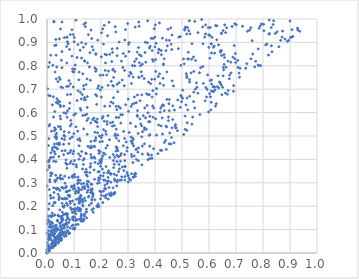
| Category | Series 0 |
|---|---|
| 0.20659024617600152 | 0.216 |
| 0.1595882859350992 | 0.366 |
| 0.5022783122837734 | 0.661 |
| 0.014627011601735303 | 0.023 |
| 0.8708775679135857 | 0.923 |
| 0.1238269095024919 | 0.231 |
| 0.2748066383766688 | 0.425 |
| 0.5081700501069504 | 0.808 |
| 0.5369264353859214 | 0.895 |
| 0.22940533535306296 | 0.28 |
| 0.0507291012930598 | 0.075 |
| 0.08151948562963185 | 0.515 |
| 0.23282890487622582 | 0.341 |
| 0.3509470010056096 | 0.496 |
| 0.1350176189112731 | 0.379 |
| 0.46287678871345395 | 0.931 |
| 0.011119935692606994 | 0.07 |
| 0.645812839691758 | 0.939 |
| 0.41077523659619003 | 0.424 |
| 0.38567772816234314 | 0.917 |
| 0.04700696801618684 | 0.647 |
| 0.6532315311546384 | 0.793 |
| 0.3492561073725203 | 0.842 |
| 0.011562703818986648 | 0.068 |
| 0.08128342170374568 | 0.467 |
| 0.21867603945372405 | 0.369 |
| 0.4439375430555527 | 0.774 |
| 0.24468991328158657 | 0.64 |
| 0.005265783653080119 | 0.007 |
| 0.03794246538813923 | 0.101 |
| 0.12398156293495016 | 0.686 |
| 0.5194820389745708 | 0.556 |
| 0.25600010063105594 | 0.454 |
| 0.5727020444227984 | 0.998 |
| 0.26732817516646984 | 0.901 |
| 0.16612893364222417 | 0.294 |
| 0.4982095696546795 | 0.647 |
| 0.2536260374636236 | 0.503 |
| 0.0406699299817603 | 0.068 |
| 0.2839238283861116 | 0.52 |
| 0.39290793220228815 | 0.917 |
| 0.5985147892601438 | 0.603 |
| 0.042279848248976404 | 0.074 |
| 0.4938443133912794 | 0.623 |
| 0.2620367883453557 | 0.689 |
| 0.16580611699807202 | 0.451 |
| 0.0004538340856108784 | 0.001 |
| 0.05547881544473306 | 0.987 |
| 0.06889590535984585 | 0.079 |
| 0.16266129144415303 | 0.258 |
| 0.8307884937646091 | 0.963 |
| 0.3338823724559998 | 0.859 |
| 0.1186083175830136 | 0.235 |
| 0.20101279854767606 | 0.396 |
| 0.0937517599832609 | 0.496 |
| 0.6934723897624867 | 0.887 |
| 0.20476507593976015 | 0.576 |
| 0.04120971670585925 | 0.275 |
| 0.1692985936536823 | 0.57 |
| 0.28629885539675737 | 0.715 |
| 0.0009645296041806804 | 0.354 |
| 0.5360201400004413 | 0.828 |
| 0.0014370166668378303 | 0.015 |
| 0.21203614964695036 | 0.563 |
| 0.08747721386081674 | 0.678 |
| 0.16131557928945228 | 0.37 |
| 0.05291620713172245 | 0.063 |
| 0.027992955133127384 | 0.032 |
| 0.07465261850898208 | 0.128 |
| 0.28460917675159086 | 0.352 |
| 0.06789787563027082 | 0.167 |
| 0.21964435155825754 | 0.248 |
| 0.09632525314077586 | 0.424 |
| 0.10674355390600654 | 0.263 |
| 0.4655703801737191 | 0.57 |
| 0.22894828137979076 | 0.253 |
| 0.23297248603286644 | 0.628 |
| 0.16661025624676912 | 0.267 |
| 0.1603126596140355 | 0.738 |
| 0.04164822182434544 | 0.042 |
| 0.0176482055008865 | 0.132 |
| 0.32437265296795914 | 0.64 |
| 0.17775796684123046 | 0.387 |
| 0.027276738055447277 | 0.038 |
| 0.35143894812218546 | 0.377 |
| 0.045162385770139826 | 0.05 |
| 0.2912353454635478 | 0.633 |
| 0.2892176773023869 | 0.369 |
| 0.044096376337534555 | 0.412 |
| 0.2268841744466071 | 0.23 |
| 0.19620719389889232 | 0.475 |
| 0.14626610581343039 | 0.187 |
| 0.08781791734118258 | 0.566 |
| 0.8025133796760705 | 0.977 |
| 0.5243593504559144 | 0.829 |
| 0.02098822196703764 | 0.202 |
| 0.013335016458879806 | 0.341 |
| 0.12421449983770834 | 0.242 |
| 0.6905324959657552 | 0.691 |
| 0.3610325074669338 | 0.466 |
| 0.22290135023622612 | 0.306 |
| 0.10838356848699818 | 0.377 |
| 0.15693293938461594 | 0.795 |
| 0.14487685588309934 | 0.72 |
| 0.1113108397096847 | 0.142 |
| 0.05356205250043837 | 0.147 |
| 0.09469819685250681 | 0.153 |
| 0.8589839340913255 | 0.882 |
| 0.4317664447428897 | 0.63 |
| 0.6911041914683271 | 0.715 |
| 0.10939038955609642 | 0.367 |
| 0.5471017215747025 | 0.99 |
| 0.4056647748065998 | 0.703 |
| 0.19133648937774336 | 0.715 |
| 0.027040897643454225 | 0.465 |
| 0.24328757192518413 | 0.715 |
| 0.1024548381636977 | 0.275 |
| 0.6462245286756323 | 0.938 |
| 0.25991960203038195 | 0.449 |
| 0.8335189610555185 | 0.86 |
| 0.1415411368095186 | 0.345 |
| 0.0024828525304180452 | 0.032 |
| 0.30916242139304845 | 0.555 |
| 0.3235359217249854 | 0.667 |
| 0.014480959060390633 | 0.428 |
| 0.5211368803131058 | 0.829 |
| 0.1691642494352353 | 0.242 |
| 0.03454848484715177 | 0.312 |
| 0.13327606586924912 | 0.2 |
| 0.31151177574057654 | 0.626 |
| 0.04881213250230101 | 0.087 |
| 0.16277831726001238 | 0.477 |
| 0.03190249505801583 | 0.101 |
| 0.3385858232046443 | 0.449 |
| 0.08122288258608408 | 0.322 |
| 0.11621952628377485 | 0.278 |
| 0.04997162793849228 | 0.115 |
| 0.23518029060121157 | 0.245 |
| 0.1592436388453549 | 0.449 |
| 0.4546871058741175 | 0.513 |
| 0.4882864956598092 | 0.922 |
| 0.3878387553159358 | 0.742 |
| 0.06302644759688579 | 0.118 |
| 0.6766067866337262 | 0.76 |
| 0.5503307607435864 | 0.823 |
| 0.7817152553280945 | 0.803 |
| 0.12068655454654995 | 0.489 |
| 0.3657626592831434 | 0.815 |
| 0.1808631187960183 | 0.493 |
| 0.09716807910446183 | 0.71 |
| 0.001384076321276523 | 0.045 |
| 0.40406813232669453 | 0.896 |
| 0.10815359367835606 | 0.144 |
| 0.38904668184431646 | 0.405 |
| 0.05471505679663392 | 0.28 |
| 0.09707649406101519 | 0.187 |
| 0.6172322283118868 | 0.691 |
| 0.043963096651518915 | 0.228 |
| 0.11875279015427284 | 0.401 |
| 0.598906335418971 | 0.932 |
| 0.30184307695230145 | 0.605 |
| 0.21444660732911167 | 0.311 |
| 0.2050735387628138 | 0.477 |
| 0.36508618736092824 | 0.578 |
| 0.24601927843579666 | 0.395 |
| 0.01054211126879861 | 0.026 |
| 0.1894064867385187 | 0.381 |
| 0.32424942918668864 | 0.819 |
| 0.5648944885562656 | 0.77 |
| 0.031350137540294545 | 0.036 |
| 0.17684319326314119 | 0.791 |
| 0.5058474946666024 | 0.829 |
| 0.3631104485357775 | 0.857 |
| 0.10888442027932162 | 0.229 |
| 0.20375756077747556 | 0.708 |
| 0.11538023529456093 | 0.122 |
| 0.01730898673225143 | 0.341 |
| 0.19331844124164738 | 0.348 |
| 0.3189638941699745 | 0.484 |
| 0.5854776324905514 | 0.65 |
| 0.0014813583867682464 | 0.003 |
| 0.5495039041374055 | 0.701 |
| 0.07966508959427449 | 0.712 |
| 0.11857767642573498 | 0.186 |
| 0.24678986670759645 | 0.365 |
| 0.39546911656590106 | 0.619 |
| 0.05548353004999401 | 0.791 |
| 0.3209536860948876 | 0.458 |
| 0.09246292701876972 | 0.116 |
| 0.6096083973993957 | 0.722 |
| 0.5689405532354916 | 0.792 |
| 0.14750735284607075 | 0.346 |
| 0.26614749646631203 | 0.479 |
| 0.001035197467917322 | 0.006 |
| 0.06048202339999591 | 0.12 |
| 0.03720410399813043 | 0.659 |
| 0.6048720527612496 | 0.737 |
| 0.6093937732804307 | 0.855 |
| 0.06404367304266861 | 0.071 |
| 0.6417404760977942 | 0.726 |
| 0.5777130001267884 | 0.894 |
| 0.1346083622079665 | 0.879 |
| 0.39272117986185145 | 0.58 |
| 0.007095069782430017 | 0.068 |
| 0.1354400369946144 | 0.715 |
| 0.0025038380344605403 | 0.034 |
| 0.2824165209557042 | 0.853 |
| 0.3914595178123973 | 0.629 |
| 0.4431684387093231 | 0.539 |
| 0.49583647471625975 | 0.802 |
| 0.3608749545211894 | 0.535 |
| 0.16566407035842437 | 0.916 |
| 0.8146413815942678 | 0.893 |
| 0.10232666570714039 | 0.208 |
| 0.11922928197169043 | 0.272 |
| 0.5335954819105253 | 0.769 |
| 0.17048895328163857 | 0.249 |
| 0.15844269186271073 | 0.343 |
| 0.20161780030830395 | 0.246 |
| 0.07652172436768921 | 0.111 |
| 0.14502810148243908 | 0.358 |
| 0.15391064075075325 | 0.305 |
| 0.13001858319130513 | 0.145 |
| 0.012332274579814484 | 0.11 |
| 0.6704643966010608 | 0.82 |
| 0.18004169486484828 | 0.482 |
| 0.3822092008412228 | 0.883 |
| 0.08496583280872767 | 0.429 |
| 0.21189344420179634 | 0.973 |
| 0.00067786258987428 | 0.003 |
| 0.09564867875752163 | 0.33 |
| 0.23686701963043397 | 0.303 |
| 0.5882558830141955 | 0.707 |
| 0.18602000775265515 | 0.573 |
| 0.24640169556907357 | 0.664 |
| 0.27578146007306265 | 0.82 |
| 0.706306244262066 | 0.823 |
| 0.07452652190579659 | 0.378 |
| 0.4133358792639825 | 0.547 |
| 0.3181603066708834 | 0.387 |
| 0.2262527956639703 | 0.716 |
| 0.608940895085316 | 0.74 |
| 0.029124502497427093 | 0.032 |
| 0.022072796214685986 | 0.022 |
| 0.26016946197287016 | 0.304 |
| 0.2601281489832459 | 0.875 |
| 0.41484987407648194 | 0.869 |
| 0.9105217026425342 | 0.926 |
| 0.09290613088603211 | 0.327 |
| 0.15267501034414271 | 0.282 |
| 0.07066888689289089 | 0.086 |
| 0.1162530270969112 | 0.181 |
| 0.14172093224614135 | 0.655 |
| 0.24712478355559098 | 0.253 |
| 0.1242015498111685 | 0.188 |
| 0.0004806410528458563 | 0.014 |
| 0.011827188728059974 | 0.077 |
| 0.027189088060341152 | 0.433 |
| 0.32832526606638485 | 0.54 |
| 0.003516153453418295 | 0.009 |
| 0.38104046738324526 | 0.561 |
| 0.6680501272599586 | 0.679 |
| 0.3310864011729484 | 0.643 |
| 0.062412648122791736 | 0.195 |
| 0.4832839810003716 | 0.523 |
| 0.19650988243713124 | 0.318 |
| 0.1367160303757769 | 0.978 |
| 0.16225861146729628 | 0.556 |
| 0.31630826174339316 | 0.636 |
| 0.16712534303095836 | 0.274 |
| 0.3350446191608294 | 0.675 |
| 0.5132704791749828 | 0.966 |
| 0.4458327686346637 | 0.885 |
| 0.06420603190999377 | 0.202 |
| 0.033188329352151255 | 0.05 |
| 0.587547246173089 | 0.975 |
| 0.17578838986154507 | 0.48 |
| 0.000559879192043743 | 0.014 |
| 0.638660864010759 | 0.73 |
| 0.6882940399962182 | 0.837 |
| 0.3731644744274738 | 0.677 |
| 0.1082050260761422 | 0.265 |
| 0.21525188184819147 | 0.422 |
| 0.6468641025522056 | 0.844 |
| 0.2587401034424371 | 0.612 |
| 0.25073038525274843 | 0.409 |
| 0.6223802113903425 | 0.697 |
| 0.07169908992704196 | 0.285 |
| 0.20217090744739907 | 0.941 |
| 0.09462666759605223 | 0.787 |
| 0.24445686967385788 | 0.278 |
| 0.28872158106115353 | 0.371 |
| 0.4524475951709396 | 0.467 |
| 0.03697898246112237 | 0.1 |
| 0.5369788338198008 | 0.551 |
| 0.901952602256966 | 0.921 |
| 0.18893539498625628 | 0.197 |
| 0.3807848701545044 | 0.584 |
| 0.5172210331118718 | 0.936 |
| 0.010208174140799104 | 0.549 |
| 0.015301478082729962 | 0.154 |
| 0.056898632940010505 | 0.091 |
| 0.5426794861192996 | 0.647 |
| 0.02812906856280369 | 0.535 |
| 0.0033407075730262155 | 0.135 |
| 0.03840374586450813 | 0.106 |
| 0.20956030358714628 | 0.427 |
| 0.025205612630865144 | 0.081 |
| 0.608492142315017 | 0.893 |
| 0.0027121371095979513 | 0.003 |
| 0.8654136636223431 | 0.909 |
| 0.9073019043401438 | 0.954 |
| 0.012079174223523188 | 0.672 |
| 0.2239023954365685 | 0.459 |
| 0.19678962212733825 | 0.433 |
| 0.21364778240186003 | 0.627 |
| 0.6312358832969048 | 0.711 |
| 0.31294274451966186 | 0.339 |
| 0.06955428612446946 | 0.384 |
| 0.03574735463992827 | 0.272 |
| 0.10409875809526933 | 0.178 |
| 0.05556017300357813 | 0.157 |
| 0.21147890812338752 | 0.244 |
| 0.19860831260014836 | 0.37 |
| 0.3247956389263706 | 0.8 |
| 0.252695597521039 | 0.508 |
| 0.5424316755186481 | 0.837 |
| 0.0771260830891967 | 0.264 |
| 0.4121596297625188 | 0.856 |
| 0.24200260078676036 | 0.542 |
| 0.3188686892853842 | 0.752 |
| 0.143907979071293 | 0.427 |
| 0.8229766712359886 | 0.996 |
| 0.7073486867303155 | 0.794 |
| 0.3904293291455712 | 0.827 |
| 0.07772885390485756 | 0.148 |
| 0.17467480712904265 | 0.457 |
| 0.04281970128047187 | 0.063 |
| 5.431080221243204e-05 | 0 |
| 0.19756983378993304 | 0.697 |
| 0.6420017041999769 | 0.864 |
| 0.23258967777264897 | 0.409 |
| 0.13161474042600316 | 0.359 |
| 0.2051648194283366 | 0.359 |
| 0.026795816143433796 | 0.213 |
| 0.35287378739711417 | 0.457 |
| 0.37185102000123177 | 0.898 |
| 0.19571682152255612 | 0.392 |
| 0.5594276328270639 | 0.942 |
| 0.14625545614304128 | 0.334 |
| 0.2909616841501067 | 0.841 |
| 0.07240806844197815 | 0.882 |
| 0.004612546325253447 | 0.024 |
| 0.12548082125996463 | 0.247 |
| 0.2324511510057638 | 0.849 |
| 0.03582168903961632 | 0.062 |
| 0.2502003161943865 | 0.315 |
| 0.10195739317108067 | 0.336 |
| 0.13607040296007855 | 0.298 |
| 0.005328136577268165 | 0.674 |
| 0.17706773749587904 | 0.406 |
| 0.2565263230333312 | 0.529 |
| 0.09495846639139159 | 0.145 |
| 0.08354928133116656 | 0.085 |
| 0.13864624854963362 | 0.234 |
| 0.6816298948643996 | 0.77 |
| 0.057314117406757785 | 0.141 |
| 0.13168989654820307 | 0.227 |
| 0.47204318060412176 | 0.611 |
| 0.16388584793131103 | 0.409 |
| 0.25822526846680555 | 0.287 |
| 0.12304481464122406 | 0.618 |
| 0.05331315112329353 | 0.823 |
| 0.30396862529691143 | 0.757 |
| 0.7855472801336173 | 0.961 |
| 0.09682079545509926 | 0.104 |
| 0.04149164545958091 | 0.075 |
| 0.019275996193591133 | 0.171 |
| 0.10463393829205622 | 0.19 |
| 0.2566016572105011 | 0.579 |
| 0.26700202167422676 | 0.728 |
| 0.03341497141195861 | 0.047 |
| 0.063787557221854 | 0.519 |
| 0.29675953472427363 | 0.345 |
| 0.07086007572908336 | 0.073 |
| 0.11831733881881239 | 0.213 |
| 0.24313837074691846 | 0.782 |
| 0.249644584846374 | 0.545 |
| 0.1322883577087804 | 0.217 |
| 0.1979130253196587 | 0.331 |
| 0.04826233886355602 | 0.065 |
| 0.013885763169103955 | 0.234 |
| 0.7910147944161134 | 0.801 |
| 0.010559148062655612 | 0.304 |
| 0.231211447223591 | 0.484 |
| 0.3183594027001147 | 0.49 |
| 0.8374532129776083 | 0.976 |
| 0.5435435461146995 | 0.688 |
| 0.25230234667905976 | 0.967 |
| 0.8455620335780614 | 0.938 |
| 0.5149886298647064 | 0.633 |
| 0.03458799863432333 | 0.068 |
| 0.009642111869437045 | 0.814 |
| 0.07550806712623541 | 0.677 |
| 0.1991119058424071 | 0.383 |
| 0.041553782617985105 | 0.65 |
| 0.11780268538977387 | 0.3 |
| 0.10172322528062593 | 0.154 |
| 0.09905233046397316 | 0.154 |
| 0.11818173644323096 | 0.74 |
| 0.005191002902795223 | 0.459 |
| 0.16272982987068188 | 0.953 |
| 0.2502713470616311 | 0.258 |
| 0.21503442054339247 | 0.849 |
| 0.09836742048751564 | 0.14 |
| 0.07884218925286582 | 0.089 |
| 0.26249890975368656 | 0.437 |
| 0.021008221785550424 | 0.026 |
| 0.0450346939699932 | 0.234 |
| 0.013503812825436652 | 0.11 |
| 0.4237750826593956 | 0.848 |
| 0.4167610594384276 | 0.765 |
| 0.02354199171189629 | 0.668 |
| 0.15188645507129733 | 0.456 |
| 0.477241318643473 | 0.534 |
| 0.4760355814946676 | 0.549 |
| 0.194216876456448 | 0.5 |
| 0.21664115304699968 | 0.812 |
| 0.616014755029678 | 0.69 |
| 0.33117164699895635 | 0.4 |
| 0.28886430612511593 | 0.327 |
| 0.32320467593711905 | 0.415 |
| 0.695807729084869 | 0.83 |
| 0.378564206070271 | 0.503 |
| 0.07674996982067657 | 0.167 |
| 0.05786385011023097 | 0.118 |
| 0.19737747516537288 | 0.396 |
| 0.03572000882715648 | 0.511 |
| 0.047505058746911584 | 0.184 |
| 0.4662026526907525 | 0.629 |
| 0.060182584005616886 | 0.083 |
| 0.32663638597902966 | 0.965 |
| 0.07519539734037083 | 0.096 |
| 0.44225687073603304 | 0.91 |
| 0.6463049251997398 | 0.865 |
| 0.028661002543484932 | 0.887 |
| 0.07290472558115581 | 0.167 |
| 0.4047932336662655 | 0.679 |
| 0.41867940673752174 | 0.725 |
| 0.3505019956890463 | 0.543 |
| 0.016646339552133897 | 0.11 |
| 0.3046845169804685 | 0.515 |
| 0.6572625409569633 | 0.835 |
| 0.1272681088304355 | 0.162 |
| 0.20625240633104805 | 0.957 |
| 0.15647858654926372 | 0.205 |
| 0.5180448733479821 | 0.524 |
| 0.15513617615325276 | 0.243 |
| 0.07701874846214948 | 0.15 |
| 0.14170809853195945 | 0.223 |
| 0.11370139232428421 | 0.521 |
| 0.7598497015771174 | 0.907 |
| 0.6210092652231334 | 0.854 |
| 0.03308978226651417 | 0.391 |
| 0.5768813033080089 | 0.966 |
| 0.005497066090367378 | 0.014 |
| 0.10708678693758661 | 0.995 |
| 0.06219740438626474 | 0.276 |
| 0.007991998508114488 | 0.068 |
| 0.4339350723019732 | 0.83 |
| 0.37384687017861384 | 0.399 |
| 0.0626811105887582 | 0.106 |
| 0.05461656468161765 | 0.133 |
| 0.07058622788822742 | 0.14 |
| 0.831098515523095 | 0.886 |
| 0.7730175103747339 | 0.819 |
| 0.05672844036249385 | 0.146 |
| 0.08438508688616933 | 0.641 |
| 0.11688646575158201 | 0.265 |
| 0.401079135428512 | 0.975 |
| 0.028730332055814697 | 0.032 |
| 0.3367156321083783 | 0.431 |
| 0.8204263556954542 | 0.846 |
| 0.041164300915691475 | 0.074 |
| 0.17023195707930655 | 0.255 |
| 0.028919424899153178 | 0.094 |
| 0.8906155476601897 | 0.905 |
| 0.03508216789089239 | 0.488 |
| 0.06555529521683558 | 0.498 |
| 0.030136459047378907 | 0.033 |
| 0.11412852379469388 | 0.31 |
| 0.11761950794490841 | 0.232 |
| 0.6288331294569456 | 0.911 |
| 0.10322692637489964 | 0.108 |
| 0.14691475731611547 | 0.15 |
| 0.35342734072309495 | 0.807 |
| 0.5663136237848112 | 0.592 |
| 0.21520237595549466 | 0.78 |
| 0.30240066935553356 | 0.892 |
| 0.7151071932123456 | 0.789 |
| 0.15186894686017938 | 0.268 |
| 0.18086043393349352 | 0.852 |
| 0.7111707180518894 | 0.769 |
| 0.7821722875546654 | 0.872 |
| 0.05559683135032669 | 0.082 |
| 0.13434909102402512 | 0.28 |
| 0.02532019765344555 | 0.072 |
| 0.03479800960339372 | 0.118 |
| 0.0036661593184268678 | 0.143 |
| 0.04211981596022961 | 0.158 |
| 0.48677828855483785 | 0.873 |
| 0.31274342427480717 | 0.421 |
| 0.44051306948545144 | 0.543 |
| 0.107995857893317 | 0.188 |
| 0.2767684763372809 | 0.325 |
| 0.14911214083147323 | 0.622 |
| 0.278844615326514 | 0.368 |
| 0.14836968565511907 | 0.744 |
| 0.3529770071183547 | 0.423 |
| 0.028153161495068763 | 0.162 |
| 0.05029232656069904 | 0.957 |
| 0.9279519736705375 | 0.961 |
| 0.5436594556769251 | 0.776 |
| 0.06501041300843252 | 0.329 |
| 0.2624661424584378 | 0.504 |
| 0.5118647469680786 | 0.528 |
| 0.15108804974329 | 0.286 |
| 0.0010262507906503944 | 0.005 |
| 0.13251087149758295 | 0.282 |
| 0.02990273052233488 | 0.774 |
| 0.12568091274964233 | 0.136 |
| 0.069639531017627 | 0.28 |
| 0.872391226779981 | 0.948 |
| 0.14227097561285482 | 0.967 |
| 0.04589570096213104 | 0.054 |
| 0.23821074565068898 | 0.734 |
| 0.16631339191168357 | 0.226 |
| 0.7238819012598396 | 0.969 |
| 0.04758114918784652 | 0.069 |
| 0.07667715940264472 | 0.204 |
| 0.46203213278265265 | 0.869 |
| 0.09760696772534135 | 0.273 |
| 0.05580706997920383 | 0.212 |
| 0.15893538769180332 | 0.856 |
| 0.03780363368259899 | 0.104 |
| 0.19819438151193255 | 0.232 |
| 0.32712389126702085 | 0.341 |
| 0.09674825004961429 | 0.933 |
| 0.05387397701606055 | 0.097 |
| 0.22814254074049903 | 0.308 |
| 0.1188807391096213 | 0.458 |
| 0.1395542510454665 | 0.284 |
| 0.22844039063740296 | 0.352 |
| 0.881606865349926 | 0.914 |
| 0.35163940239151686 | 0.757 |
| 0.1223386980419644 | 0.311 |
| 0.5273724603938768 | 0.993 |
| 0.06525108736095245 | 0.109 |
| 0.13239495837850188 | 0.205 |
| 0.28836469975231577 | 0.312 |
| 0.13871735077509886 | 0.166 |
| 0.08923654595051388 | 0.391 |
| 0.21061558342241082 | 0.342 |
| 0.08577671411035095 | 0.107 |
| 0.2658050186774883 | 0.579 |
| 0.2426609574728415 | 0.857 |
| 0.08984006439870365 | 0.551 |
| 0.356484109811478 | 0.587 |
| 0.03905243813959394 | 0.321 |
| 0.14554285728706431 | 0.424 |
| 0.7545150486029184 | 0.963 |
| 0.20079060237632246 | 0.261 |
| 0.03586887230638558 | 0.495 |
| 0.012593726241831976 | 0.123 |
| 0.030071622969705798 | 0.216 |
| 0.43140071848383665 | 0.808 |
| 0.14359404889177318 | 0.893 |
| 0.2959629946889766 | 0.436 |
| 0.21719721607401363 | 0.274 |
| 0.647887989649671 | 0.676 |
| 0.605470326442796 | 0.667 |
| 0.07574859129510368 | 0.608 |
| 0.07453001788522239 | 0.58 |
| 0.05847128537048956 | 0.317 |
| 0.6331439035930999 | 0.757 |
| 0.09223536318954875 | 0.841 |
| 0.06810479247879929 | 0.167 |
| 0.14990984928475304 | 0.813 |
| 0.3538421580410029 | 0.518 |
| 0.1744487857785773 | 0.355 |
| 0.05973402008105277 | 0.231 |
| 0.3460598822854401 | 0.8 |
| 0.01621471843189598 | 0.025 |
| 0.265043771622104 | 0.348 |
| 0.127973824172489 | 0.833 |
| 0.347179085705292 | 0.551 |
| 0.06727768185082297 | 0.438 |
| 0.45312497631295146 | 0.656 |
| 0.4985229531944528 | 0.668 |
| 0.15271565024591355 | 0.575 |
| 0.37610173708936023 | 0.731 |
| 0.20902277647237402 | 0.893 |
| 0.17384635997183867 | 0.577 |
| 0.3932974806356969 | 0.819 |
| 0.31264828606935974 | 0.724 |
| 0.12814563869633994 | 0.899 |
| 0.0924771693472356 | 0.954 |
| 0.40249275512271926 | 0.573 |
| 0.16728349040849524 | 0.882 |
| 0.049288091518327415 | 0.742 |
| 0.10717914107445195 | 0.539 |
| 0.12452488546953104 | 0.144 |
| 0.045009503677451934 | 0.099 |
| 0.4500387042990332 | 0.581 |
| 0.19186088071110666 | 0.438 |
| 0.18302769925486137 | 0.784 |
| 0.007248075952271406 | 0.08 |
| 0.09349339592767626 | 0.173 |
| 0.18093881892009694 | 0.849 |
| 0.007551837072669671 | 0.112 |
| 0.3239706388272097 | 0.336 |
| 0.10086659672203227 | 0.29 |
| 0.7504282763413676 | 0.952 |
| 0.0049636065031908915 | 0.019 |
| 0.9360480155440801 | 0.948 |
| 0.3705617133044515 | 0.631 |
| 0.1660229415619698 | 0.231 |
| 0.02015127387007009 | 0.041 |
| 0.16209423737058654 | 0.421 |
| 0.34101951574169354 | 0.75 |
| 0.18747410108628543 | 0.54 |
| 0.1263024089385191 | 0.224 |
| 0.4530697099647302 | 0.909 |
| 0.335072704981809 | 0.608 |
| 0.11270733975559862 | 0.296 |
| 0.08627707311577186 | 0.933 |
| 0.5993718848202371 | 0.879 |
| 0.5281680939966996 | 0.741 |
| 0.08725915105832303 | 0.193 |
| 0.18060964272396351 | 0.777 |
| 0.6164923059463187 | 0.879 |
| 0.189707201724532 | 0.21 |
| 0.056645892894869654 | 0.174 |
| 0.2720750967576056 | 0.392 |
| 0.12553652423771164 | 0.61 |
| 0.38378399275112834 | 0.724 |
| 0.14822666182326008 | 0.294 |
| 0.05561773436054188 | 0.104 |
| 0.14606875671562636 | 0.175 |
| 0.8033161982954787 | 0.95 |
| 0.03419052900716441 | 0.744 |
| 0.13894767164198676 | 0.655 |
| 0.06394649291650233 | 0.92 |
| 0.22283146170696025 | 0.55 |
| 0.37356646542821365 | 0.424 |
| 0.3007953755706077 | 0.658 |
| 0.12058266648650806 | 0.189 |
| 0.028933032919801288 | 0.604 |
| 0.03274321429464532 | 0.913 |
| 0.004363966291845503 | 0.062 |
| 0.1661326572174395 | 0.407 |
| 0.03400440518260688 | 0.889 |
| 0.1371606981279245 | 0.159 |
| 0.09973045648588369 | 0.773 |
| 0.5588455381146414 | 0.683 |
| 0.6425375584552421 | 0.858 |
| 0.08520870642791957 | 0.383 |
| 0.5112632426858432 | 0.585 |
| 0.07840081185600942 | 0.246 |
| 0.597419269601697 | 0.963 |
| 0.12854331929419402 | 0.434 |
| 0.07742012782341803 | 0.425 |
| 0.18013313839410974 | 0.677 |
| 0.042629267657990216 | 0.464 |
| 0.10227323934073193 | 0.18 |
| 0.1016214218657032 | 0.102 |
| 0.32738637426772565 | 0.328 |
| 0.13932538343424786 | 0.82 |
| 0.01979224165540324 | 0.439 |
| 0.6630995723734388 | 0.793 |
| 0.6953401172142999 | 0.979 |
| 0.6209642708211385 | 0.709 |
| 0.12467528267821631 | 0.241 |
| 0.15341808428091716 | 0.24 |
| 0.18701479055437303 | 0.514 |
| 0.2594546540401062 | 0.843 |
| 0.1152822928578321 | 0.325 |
| 0.000754919965010009 | 0.286 |
| 0.004561244090988459 | 0.022 |
| 0.023910468430795112 | 0.236 |
| 0.14042295038029295 | 0.589 |
| 0.6525173948317827 | 0.951 |
| 0.02938928471315489 | 0.495 |
| 0.20125454302311238 | 0.389 |
| 0.20975584128520341 | 0.527 |
| 0.12359678331152893 | 0.414 |
| 0.21763638118202258 | 0.236 |
| 0.904737555372249 | 0.922 |
| 0.24929542596703785 | 0.379 |
| 0.23719031193878168 | 0.645 |
| 0.03614542480638396 | 0.795 |
| 0.5215891819462247 | 0.612 |
| 0.39726014886086225 | 0.958 |
| 0.25543083391826116 | 0.435 |
| 0.1493536543520224 | 0.307 |
| 0.09653537129570684 | 0.119 |
| 0.013618817436070801 | 0.091 |
| 0.0627212035366214 | 0.504 |
| 0.5907473770567454 | 0.667 |
| 0.2703293434134973 | 0.311 |
| 0.08809508190660584 | 0.438 |
| 0.08132564899089993 | 0.082 |
| 0.8239880775438538 | 0.938 |
| 0.3389997827533646 | 0.878 |
| 0.07422172467771128 | 0.923 |
| 0.18892499409785576 | 0.346 |
| 0.20604081408358504 | 0.415 |
| 0.015206147843134803 | 0.409 |
| 0.4256385002986259 | 0.628 |
| 0.2511858338911222 | 0.309 |
| 0.032829078545249926 | 0.506 |
| 0.033146931049023165 | 0.047 |
| 0.03385770440921768 | 0.046 |
| 0.16192869873080484 | 0.258 |
| 0.1663025186115674 | 0.184 |
| 0.045213532780383744 | 0.071 |
| 0.03065107603314393 | 0.423 |
| 0.06598909427424846 | 0.234 |
| 0.07030104824921896 | 0.398 |
| 0.5094228948273807 | 0.953 |
| 0.008472167916298772 | 0.271 |
| 0.20735785115250574 | 0.583 |
| 0.3739940459700432 | 0.599 |
| 0.10753471717668077 | 0.121 |
| 0.280773665492984 | 0.793 |
| 0.08380422942190598 | 0.241 |
| 0.0827650596425843 | 0.618 |
| 0.3727340715760549 | 0.992 |
| 0.08117867004312353 | 0.737 |
| 0.04832885199828968 | 0.129 |
| 0.1044416435241682 | 0.803 |
| 0.22754545286211436 | 0.777 |
| 0.024811356429222744 | 0.085 |
| 0.10048851077870657 | 0.903 |
| 0.6984579828576317 | 0.814 |
| 0.11133575188457509 | 0.835 |
| 0.06572490128701107 | 0.09 |
| 0.6854963303942205 | 0.968 |
| 0.28734550949403714 | 0.78 |
| 0.006149914343421958 | 0.187 |
| 0.02043811243586392 | 0.126 |
| 0.31430669736229766 | 0.412 |
| 0.6037546902054268 | 0.93 |
| 0.4589642026048253 | 0.466 |
| 0.07305185994131078 | 0.122 |
| 0.3512430574411665 | 0.676 |
| 0.18794075372563537 | 0.704 |
| 0.7425353162442905 | 0.947 |
| 0.0282810408920378 | 0.099 |
| 0.7899475666306595 | 0.97 |
| 0.37590467149427714 | 0.419 |
| 0.08339718100839949 | 0.87 |
| 0.5393704902074945 | 0.581 |
| 0.1306959668998436 | 0.677 |
| 0.23504057845525683 | 0.556 |
| 0.003399083977975286 | 0.004 |
| 0.09702840244785232 | 0.38 |
| 0.08503582423465982 | 0.221 |
| 0.38134127103392496 | 0.506 |
| 0.4211323292559382 | 0.619 |
| 0.6976476368288856 | 0.852 |
| 0.1913205462825943 | 0.321 |
| 0.6524673940040143 | 0.757 |
| 0.1011742835477396 | 0.921 |
| 0.23570961414049557 | 0.336 |
| 0.3805627823662178 | 0.457 |
| 0.11439720096437847 | 0.891 |
| 0.3043607063547168 | 0.899 |
| 0.30947756473227295 | 0.312 |
| 0.07069750349302757 | 0.597 |
| 0.05752298441678999 | 0.707 |
| 0.3396752945359772 | 0.751 |
| 0.60922672103708 | 0.692 |
| 0.4777021035312172 | 0.535 |
| 0.3115111814149013 | 0.495 |
| 0.5931898167266877 | 0.699 |
| 0.18381414319597164 | 0.635 |
| 0.1720705679313948 | 0.19 |
| 0.062171406899770416 | 0.627 |
| 0.735980981015983 | 0.79 |
| 0.036774714258491235 | 0.467 |
| 0.6543468182570489 | 0.783 |
| 0.02901616239801496 | 0.065 |
| 0.5234511176928165 | 0.858 |
| 0.006546680052635231 | 0.073 |
| 0.20157690181341711 | 0.838 |
| 0.3398965387704002 | 0.987 |
| 0.012131096823747104 | 0.159 |
| 0.14783187976029674 | 0.566 |
| 0.04541905333040743 | 0.082 |
| 0.38945512382353237 | 0.865 |
| 0.2981360194253121 | 0.335 |
| 0.03368266507658645 | 0.846 |
| 0.03701686467894191 | 0.067 |
| 0.03184367861580144 | 0.062 |
| 0.09442377973068325 | 0.222 |
| 0.026687908914041464 | 0.098 |
| 0.4936023415297174 | 0.925 |
| 0.7696049832249177 | 0.796 |
| 0.22447307886196957 | 0.343 |
| 0.0027401458577558527 | 0.009 |
| 0.0653855864015494 | 0.12 |
| 0.003429503691483944 | 0.004 |
| 0.3200904865600006 | 0.324 |
| 0.05543984482651793 | 0.232 |
| 0.051436418601565635 | 0.318 |
| 0.21739209488802555 | 0.52 |
| 0.46311244953925834 | 0.535 |
| 0.19706925171235656 | 0.759 |
| 0.22580586124456728 | 0.587 |
| 0.5552610679111089 | 0.708 |
| 0.17706894986680496 | 0.228 |
| 0.34445687847960077 | 0.573 |
| 0.50634021666884 | 0.507 |
| 0.04817585070824213 | 0.077 |
| 0.13936241410891895 | 0.82 |
| 0.004621401394672873 | 0.795 |
| 0.38132317783270325 | 0.403 |
| 0.0247012888472507 | 0.392 |
| 0.4276662241036692 | 0.508 |
| 0.049707111346652524 | 0.539 |
| 0.13248214371676353 | 0.766 |
| 0.008362157795483615 | 0.009 |
| 0.8952884118272703 | 0.909 |
| 0.1638487133167234 | 0.457 |
| 0.046924728882073746 | 0.464 |
| 0.07557381583375758 | 0.903 |
| 0.001088603319936801 | 0.016 |
| 0.4407206620552505 | 0.865 |
| 0.3791062482812943 | 0.677 |
| 0.2652843001731174 | 0.626 |
| 0.449537888714824 | 0.566 |
| 0.05372752511859383 | 0.06 |
| 0.21811140471896118 | 0.448 |
| 0.02596932154138589 | 0.99 |
| 0.3009011287334189 | 0.303 |
| 0.020490029210939658 | 0.076 |
| 0.04067806182199161 | 0.733 |
| 0.010298854172897604 | 0.313 |
| 0.03996080426282976 | 0.275 |
| 0.061350794384993634 | 0.465 |
| 0.03170248702171651 | 0.529 |
| 0.1066657228463132 | 0.139 |
| 0.43149593325157937 | 0.805 |
| 0.07857594158854175 | 0.893 |
| 0.04449705898401873 | 0.062 |
| 0.22637083062757796 | 0.323 |
| 0.25490248828551093 | 0.945 |
| 0.2662457785459186 | 0.378 |
| 0.006805561961678082 | 0.489 |
| 0.7620567473602295 | 0.85 |
| 0.05020393892660432 | 0.332 |
| 0.1846293990884933 | 0.671 |
| 0.09026101848662424 | 0.186 |
| 0.1851613073350784 | 0.2 |
| 0.13265963224093727 | 0.588 |
| 0.0025342676602419525 | 0.006 |
| 0.6711527284043587 | 0.695 |
| 0.031148378817692307 | 0.054 |
| 0.24669255640517404 | 0.75 |
| 0.31202096359879133 | 0.766 |
| 0.45842296463689397 | 0.962 |
| 0.20137255298312884 | 0.667 |
| 0.3114775560947038 | 0.478 |
| 0.041583594191306694 | 0.065 |
| 0.2515433660266576 | 0.775 |
| 0.030285387441897613 | 0.117 |
| 0.06492734866155889 | 0.485 |
| 0.5839462969176394 | 0.923 |
| 0.45141596200325274 | 0.638 |
| 0.08644619223845844 | 0.212 |
| 0.13777761955905402 | 0.404 |
| 0.002211963984799056 | 0.392 |
| 0.03577902600498448 | 0.058 |
| 0.3308568831832418 | 0.443 |
| 0.419208933707401 | 0.602 |
| 0.5773251906599726 | 0.797 |
| 0.028698474051467505 | 0.162 |
| 0.3766321241370614 | 0.561 |
| 0.00897929579815656 | 0.365 |
| 0.013813975642929369 | 0.329 |
| 0.28271854779964306 | 0.459 |
| 0.24364222608879224 | 0.559 |
| 0.11710224595577237 | 0.424 |
| 0.14699538823107725 | 0.593 |
| 0.022675638834310927 | 0.047 |
| 0.23696381848382048 | 0.339 |
| 0.27177149270380563 | 0.619 |
| 0.02774001043777913 | 0.056 |
| 0.41999937948817384 | 0.439 |
| 0.055725173356921495 | 0.437 |
| 0.0841648827594259 | 0.267 |
| 0.12765908192023975 | 0.296 |
| 0.1490027832348463 | 0.507 |
| 0.14296198991592973 | 0.983 |
| 0.21915949620962616 | 0.507 |
| 0.03770476852848213 | 0.276 |
| 0.5157250663551816 | 0.766 |
| 0.04215925386302452 | 0.541 |
| 0.044808117759622464 | 0.241 |
| 0.22281410372721597 | 0.297 |
| 0.005643245473883882 | 0.033 |
| 0.1938058164969657 | 0.3 |
| 0.10755370793843042 | 0.167 |
| 0.4392923333629837 | 0.481 |
| 0.45305389429738313 | 0.608 |
| 0.02880497192276507 | 0.082 |
| 0.36100776932524703 | 0.527 |
| 0.005012318556134719 | 0.096 |
| 0.0919976640155801 | 0.286 |
| 0.16169281529882348 | 0.382 |
| 0.02225665462441452 | 0.114 |
| 0.10101763721193799 | 0.284 |
| 0.01841096496335766 | 0.338 |
| 0.9001445823136712 | 0.991 |
| 0.5189305844662762 | 0.663 |
| 0.6455248300240749 | 0.718 |
| 5.0550047904162884e-05 | 0.001 |
| 7.842055672083363e-05 | 0 |
| 0.013757146387371702 | 0.845 |
| 0.14942439786747502 | 0.668 |
| 0.5470867803571419 | 0.62 |
| 0.39932701197307624 | 0.923 |
| 0.029233500368387382 | 0.31 |
| 0.6808816463883245 | 0.815 |
| 0.08412743936412558 | 0.142 |
| 0.6362940892956349 | 0.705 |
| 0.635353181760937 | 0.889 |
| 0.2791403507429679 | 0.591 |
| 0.31671808772901405 | 0.467 |
| 0.13963920330749097 | 0.274 |
| 0.030203874791690313 | 0.048 |
| 0.3793485096270204 | 0.876 |
| 0.1616353716343646 | 0.272 |
| 0.3638293158554005 | 0.901 |
| 0.038704232603179164 | 0.14 |
| 0.23717270030037851 | 0.257 |
| 0.416351333464104 | 0.983 |
| 0.06169269930495158 | 0.42 |
| 0.30081213488731573 | 0.33 |
| 0.18787862694979143 | 0.91 |
| 0.27313384522802 | 0.591 |
| 0.23892593576535248 | 0.247 |
| 0.2882124977131377 | 0.91 |
| 0.3300901757407928 | 0.442 |
| 0.6562016568301055 | 0.806 |
| 0.0721829439185398 | 0.263 |
| 0.07383339299039342 | 0.921 |
| 0.24952827474739472 | 0.253 |
| 0.040418195224567174 | 0.162 |
| 0.27551581881824805 | 0.312 |
| 0.5181986972702276 | 0.749 |
| 0.05870382107107649 | 0.146 |
| 0.03013854299360882 | 0.306 |
| 0.3682993401652283 | 0.529 |
| 0.0008499212865834153 | 0.126 |
| 0.014204114849023165 | 0.059 |
| 0.33497950701505086 | 0.584 |
| 0.08613191294673639 | 0.543 |
| 0.20770454943098152 | 0.329 |
| 0.03370876744321906 | 0.276 |
| 0.6023650093724374 | 0.681 |
| 0.2568468515812122 | 0.49 |
| 0.42830040150348314 | 0.633 |
| 0.6271469755271565 | 0.638 |
| 0.17647167551109458 | 0.454 |
| 0.027369458066278687 | 0.523 |
| 0.24846789973888395 | 0.337 |
| 0.015389339076579215 | 0.023 |
| 0.12138211430150887 | 0.213 |
| 0.133640508780152 | 0.397 |
| 0.3382249830439395 | 0.394 |
| 0.17619511333037885 | 0.315 |
| 0.25172886420365936 | 0.502 |
| 0.12420027193280425 | 0.184 |
| 0.41192199523208806 | 0.754 |
| 0.01881012234822772 | 0.097 |
| 0.12306608875351296 | 0.479 |
| 0.07448270229256715 | 0.158 |
| 0.050312755534586674 | 0.111 |
| 0.32834676826538683 | 0.338 |
| 0.06904643450597732 | 0.23 |
| 0.017613783189325466 | 0.053 |
| 0.24588650578490862 | 0.713 |
| 0.006478659613087563 | 0.06 |
| 0.01066429703227283 | 0.131 |
| 0.055502216603292284 | 0.861 |
| 0.47452660391309703 | 0.542 |
| 0.1376513569845823 | 0.144 |
| 0.4418573518072301 | 0.443 |
| 0.8099358283299247 | 0.889 |
| 0.4843890142928899 | 0.654 |
| 0.34483040886790217 | 0.651 |
| 0.05348656795857679 | 0.055 |
| 0.468191487237196 | 0.714 |
| 0.272886567110414 | 0.417 |
| 0.20903946876063875 | 0.265 |
| 0.7129217888188488 | 0.751 |
| 0.045037593104492256 | 0.47 |
| 0.31488713080430786 | 0.474 |
| 0.14489791025309195 | 0.176 |
| 0.4440454849868268 | 0.656 |
| 0.040394555599735704 | 0.639 |
| 0.02012526449294856 | 0.449 |
| 0.2658593498200778 | 0.413 |
| 0.20470141143062826 | 0.504 |
| 0.6556874954934854 | 0.848 |
| 0.6171758877121708 | 0.711 |
| 0.24499454514736282 | 0.421 |
| 0.09959287150824385 | 0.51 |
| 0.4265189538864006 | 0.577 |
| 0.06986951122864939 | 0.126 |
| 0.10495971292720123 | 0.255 |
| 0.1229363606230702 | 0.179 |
| 0.3040207263569335 | 0.861 |
| 0.3993901775598087 | 0.881 |
| 0.7402010544088702 | 0.809 |
| 0.18495861135992056 | 0.202 |
| 0.024074257877641354 | 0.409 |
| 0.20325643945516478 | 0.405 |
| 0.004568126550806495 | 0.158 |
| 0.002416315534976662 | 0.003 |
| 0.7943941592996235 | 0.979 |
| 0.04930638808956681 | 0.156 |
| 0.3894409408007091 | 0.667 |
| 0.02502560885042949 | 0.988 |
| 0.6033184501003044 | 0.832 |
| 0.04767436689169699 | 0.057 |
| 0.1709985111062986 | 0.174 |
| 0.11910333399732655 | 0.773 |
| 0.16471245887575978 | 0.213 |
| 0.008326018453630126 | 0.398 |
| 0.13570446165979932 | 0.53 |
| 0.024042196987238838 | 0.581 |
| 0.11872565495644277 | 0.222 |
| 0.5105579614770429 | 0.959 |
| 0.02232619023731141 | 0.099 |
| 0.6243555641745138 | 0.973 |
| 0.07197095177115907 | 0.213 |
| 0.11428479133775482 | 0.194 |
| 0.0010284108360004327 | 0.084 |
| 0.024830974512680997 | 0.278 |
| 0.008394675577889386 | 0.373 |
| 0.2934684994496518 | 0.475 |
| 0.9285916764025732 | 0.953 |
| 0.29081014502420954 | 0.955 |
| 0.6082714379156402 | 0.894 |
| 0.0741039858395438 | 0.232 |
| 0.6504759632147469 | 0.708 |
| 0.6615650657253745 | 0.942 |
| 0.6070718160276618 | 0.611 |
| 0.4245948467578166 | 0.439 |
| 0.5533039022643611 | 0.727 |
| 0.25634502238072904 | 0.627 |
| 0.03443964770701585 | 0.643 |
| 0.3946936113198753 | 0.446 |
| 0.11402356781129305 | 0.485 |
| 0.5282704814014846 | 0.67 |
| 0.013176686929649423 | 0.407 |
| 0.13874120946295654 | 0.664 |
| 0.5948856825784168 | 0.761 |
| 0.2591390595466265 | 0.445 |
| 0.008727775769417735 | 0.136 |
| 0.22146535486440067 | 0.761 |
| 0.17873503931771068 | 0.563 |
| 0.4144175117268243 | 0.871 |
| 0.027295992685911197 | 0.216 |
| 0.29865025536088 | 0.98 |
| 0.0334468169632197 | 0.092 |
| 0.4021928465496357 | 0.826 |
| 0.11152594622675116 | 0.652 |
| 0.520426826414768 | 0.963 |
| 0.02905839576899867 | 0.106 |
| 0.17985574929688403 | 0.563 |
| 0.07339336611523598 | 0.812 |
| 0.26849009434335736 | 0.359 |
| 0.1346171460313722 | 0.138 |
| 0.01680046734016863 | 0.52 |
| 0.007601831017006697 | 0.072 |
| 0.0009665769707190464 | 0.086 |
| 0.04653711020515579 | 0.322 |
| 0.25955483721210165 | 0.721 |
| 0.27319053484901223 | 0.555 |
| 0.43467040181196537 | 0.472 |
| 0.3873640132796163 | 0.418 |
| 0.09935469665754987 | 0.589 |
| 0.8522113817380719 | 0.945 |
| 0.4955407997978202 | 0.673 |
| 0.27857251308125475 | 0.739 |
| 0.42277862005948946 | 0.543 |
| 0.10560062437386278 | 0.595 |
| 0.46350018387103387 | 0.736 |
| 0.30782980729268367 | 0.772 |
| 0.01593377269413467 | 0.039 |
| 0.008400523207868915 | 0.21 |
| 0.11914343658352769 | 0.144 |
| 0.3039996836715374 | 0.319 |
| 0.01415060559259195 | 0.079 |
| 0.04582230634922796 | 0.915 |
| 0.05738274894698509 | 0.083 |
| 0.07295831232027432 | 0.712 |
| 0.02148673184221483 | 0.16 |
| 0.1742672814329346 | 0.41 |
| 0.2971609633635045 | 0.451 |
| 0.10346121377684435 | 0.786 |
| 0.19021583503913045 | 0.311 |
| 0.07378558048670723 | 0.362 |
| 0.10183151966186652 | 0.395 |
| 0.434286122428816 | 0.608 |
| 0.2225726703224119 | 0.562 |
| 0.2649103647653752 | 0.412 |
| 0.05142736173947176 | 0.709 |
| 0.5253330534168955 | 0.95 |
| 0.05887151866181681 | 0.199 |
| 0.3311767281157202 | 0.829 |
| 0.7844136788319631 | 0.801 |
| 0.28790911084539805 | 0.395 |
| 0.04091765042589173 | 0.252 |
| 0.018526063765561814 | 0.088 |
| 0.1855689424226924 | 0.558 |
| 0.019886672608308304 | 0.633 |
| 0.19264580719832244 | 0.199 |
| 0.0811842133220937 | 0.131 |
| 0.03222423115398054 | 0.051 |
| 0.2013213840920687 | 0.493 |
| 0.11599943123555595 | 0.313 |
| 0.05026785180621159 | 0.573 |
| 0.012701200008873339 | 0.246 |
| 0.31609700413549774 | 0.801 |
| 0.047732619195911825 | 0.268 |
| 0.05967173871124317 | 0.278 |
| 0.22023270377247514 | 0.847 |
| 0.18708453700393218 | 0.297 |
| 0.6651695735806434 | 0.962 |
| 0.46108580830195967 | 0.493 |
| 0.039089574351326206 | 0.445 |
| 0.004556580360002561 | 0.013 |
| 0.09539291320551184 | 0.775 |
| 0.09879038204259616 | 0.435 |
| 0.4597432651953547 | 0.892 |
| 0.2875199194726546 | 0.421 |
| 0.17731989161423783 | 0.516 |
| 0.629639938425498 | 0.97 |
| 0.006863865911069163 | 0.39 |
| 0.34206022098319744 | 0.814 |
| 0.12255243046315609 | 0.867 |
| 0.6606026640539282 | 0.684 |
| 0.34265155387062546 | 0.847 |
| 0.08660340032286719 | 0.723 |
| 0.47064692383847967 | 0.471 |
| 0.021366901830050727 | 0.802 |
| 0.09445706996669186 | 0.323 |
| 0.6238273303061743 | 0.628 |
| 0.22943120695605604 | 0.986 |
| 0.1268129315441299 | 0.659 |
| 0.05113645932409483 | 0.316 |
| 0.1366444588737565 | 0.7 |
| 0.4297473863178773 | 0.746 |
| 0.05464470663603884 | 0.149 |
| 0.02844068180783366 | 0.067 |
| 0.34885361864827324 | 0.775 |
| 0.19300906506671292 | 0.425 |
| 0.5281930862463747 | 0.731 |
| 0.02590015763482509 | 0.259 |
| 0.31908977181505344 | 0.324 |
| 0.05622213461032126 | 0.077 |
| 0.002628730514545299 | 0.702 |
| 0.13811731142649658 | 0.158 |
| 0.2244138801229679 | 0.929 |
| 0.23920173903207023 | 0.25 |
| 0.40549867975890314 | 0.504 |
| 0.03447767589715778 | 0.449 |
| 0.43184377240149757 | 0.716 |
| 0.006025448401220421 | 0.056 |
| 0.6753152174341059 | 0.744 |
| 0.05098093662472149 | 0.529 |
| 0.0026542422114076065 | 0.007 |
| 0.517850930685597 | 0.756 |
| 0.004995261969206754 | 0.011 |
| 0.01111903730362975 | 0.119 |
| 0.038834545646441176 | 0.137 |
| 0.11508117310892714 | 0.693 |
| 0.17107161253017814 | 0.868 |
| 0.25752089941498535 | 0.332 |
| 0.13279130965348443 | 0.136 |
| 0.5295909729316653 | 0.936 |
| 0.03104745541632736 | 0.056 |
| 0.8224283349156853 | 0.935 |
| 0.03149316994597872 | 0.05 |
| 0.12616871293656354 | 0.154 |
| 0.0619218325186016 | 0.164 |
| 0.2592131601954519 | 0.391 |
| 0.20997275090752685 | 0.312 |
| 0.6079515590411502 | 0.644 |
| 0.03268415946340156 | 0.332 |
| 0.19528656036913783 | 0.265 |
| 0.04882323728474304 | 0.632 |
| 0.1533000013138412 | 0.933 |
| 0.08563544623308834 | 0.489 |
| 0.04852690768278139 | 0.585 |
| 0.2586207574737136 | 0.418 |
| 0.6149508899280367 | 0.71 |
| 0.42294769159055556 | 0.866 |
| 0.1045553762465317 | 0.324 |
| 0.11639880381084211 | 0.257 |
| 0.23983343823358166 | 0.818 |
| 0.3343703759942249 | 0.588 |
| 0.4027798345047311 | 0.776 |
| 0.01037747502442798 | 0.013 |
| 7.744438082143927e-05 | 0.005 |
| 0.8392627010497695 | 0.993 |
| 0.4277519809202971 | 0.918 |
| 0.0561736242884551 | 0.141 |
| 0.20760575184952298 | 0.761 |
| 0.6194947515999422 | 0.884 |
| 0.21369138903163798 | 0.277 |
| 0.10027155177971553 | 0.174 |
| 0.12712243060577905 | 0.27 |
| 0.047648540694506705 | 0.127 |
| 0.027967427271392176 | 0.454 |
| 0.341500929220699 | 0.969 |
| 0.017229100983391265 | 0.037 |
| 0.6580965105740061 | 0.975 |
| 0.28760317970187893 | 0.489 |
| 0.02835014601672911 | 0.043 |
| 0.391952717403216 | 0.694 |
| 0.06285157288743946 | 0.6 |
| 0.16313192819601366 | 0.294 |
| 0.0668016186632207 | 0.298 |
| 0.1491469974345 | 0.329 |
| 0.08315203064887972 | 0.247 |
| 0.21436499680480056 | 0.29 |
| 0.12713344239780594 | 0.165 |
| 0.241251878499098 | 0.872 |
| 0.36192246927359195 | 0.62 |
| 0.012456126718851889 | 0.245 |
| 0.39900642377040035 | 0.743 |
| 0.0710061031107807 | 0.261 |
| 0.7555563925686888 | 0.83 |
| 0.5870093124374023 | 0.936 |
| 0.35987444769019494 | 0.746 |
| 0.605096571735196 | 0.964 |
| 0.7013647352393331 | 0.975 |
| 0.0076502121368900704 | 0.542 |
| 0.05539916834450095 | 0.489 |
| 0.2609824244562341 | 0.311 |
| 0.33751873690841866 | 0.511 |
| 0.2453381139609691 | 0.786 |
| 0.4485066507461105 | 0.956 |
| 0.3685962178947539 | 0.681 |
| 0.5791248497225826 | 0.725 |
| 0.6112232076545989 | 0.921 |
| 0.04996138833843374 | 0.626 |
| 0.14874449978695312 | 0.259 |
| 0.5027336032382549 | 0.696 |
| 0.04536344585716305 | 0.751 |
| 0.25077584204967146 | 0.259 |
| 0.09071847529278843 | 0.282 |